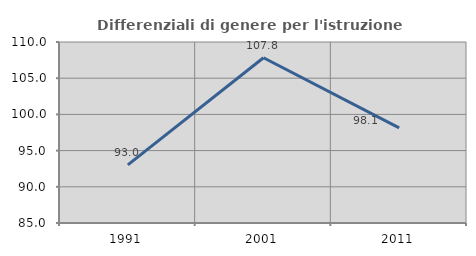
| Category | Differenziali di genere per l'istruzione superiore |
|---|---|
| 1991.0 | 93.023 |
| 2001.0 | 107.826 |
| 2011.0 | 98.128 |